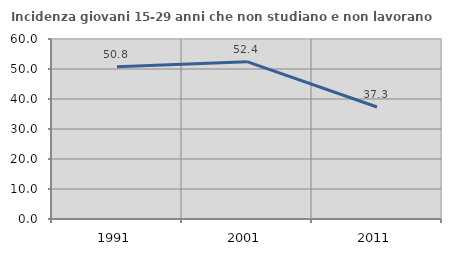
| Category | Incidenza giovani 15-29 anni che non studiano e non lavorano  |
|---|---|
| 1991.0 | 50.752 |
| 2001.0 | 52.448 |
| 2011.0 | 37.329 |